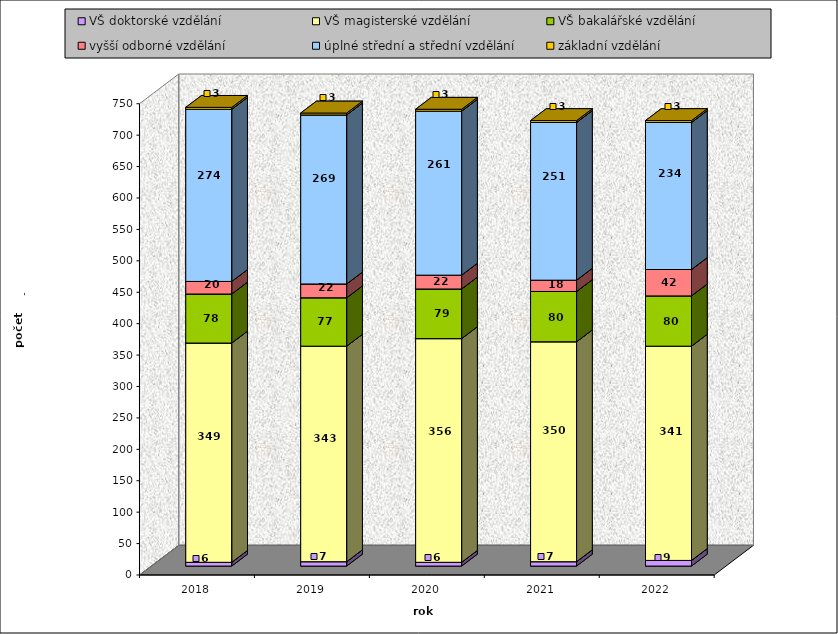
| Category | VŠ doktorské vzdělání | VŠ magisterské vzdělání | VŠ bakalářské vzdělání | vyšší odborné vzdělání | úplné střední a střední vzdělání | základní vzdělání |
|---|---|---|---|---|---|---|
| 2018.0 | 6 | 349 | 78 | 20 | 274 | 3 |
| 2019.0 | 7 | 343 | 77 | 22 | 269 | 3 |
| 2020.0 | 6 | 356 | 79 | 22 | 261 | 3 |
| 2021.0 | 7 | 350 | 80 | 18 | 251 | 3 |
| 2022.0 | 9 | 341 | 80 | 42 | 234 | 3 |